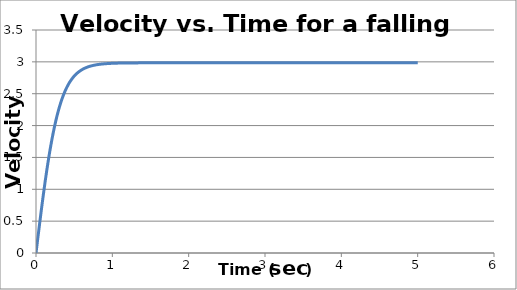
| Category | Series 0 |
|---|---|
| 0.0 | 0 |
| 0.005 | 0.049 |
| 0.01 | 0.098 |
| 0.015 | 0.147 |
| 0.02 | 0.196 |
| 0.025 | 0.245 |
| 0.030000000000000002 | 0.293 |
| 0.035 | 0.342 |
| 0.04 | 0.39 |
| 0.045 | 0.438 |
| 0.049999999999999996 | 0.486 |
| 0.05499999999999999 | 0.534 |
| 0.05999999999999999 | 0.581 |
| 0.06499999999999999 | 0.629 |
| 0.06999999999999999 | 0.675 |
| 0.075 | 0.722 |
| 0.08 | 0.768 |
| 0.085 | 0.814 |
| 0.09000000000000001 | 0.859 |
| 0.09500000000000001 | 0.904 |
| 0.10000000000000002 | 0.949 |
| 0.10500000000000002 | 0.993 |
| 0.11000000000000003 | 1.036 |
| 0.11500000000000003 | 1.079 |
| 0.12000000000000004 | 1.122 |
| 0.12500000000000003 | 1.164 |
| 0.13000000000000003 | 1.205 |
| 0.13500000000000004 | 1.247 |
| 0.14000000000000004 | 1.287 |
| 0.14500000000000005 | 1.327 |
| 0.15000000000000005 | 1.366 |
| 0.15500000000000005 | 1.405 |
| 0.16000000000000006 | 1.443 |
| 0.16500000000000006 | 1.481 |
| 0.17000000000000007 | 1.518 |
| 0.17500000000000007 | 1.554 |
| 0.18000000000000008 | 1.59 |
| 0.18500000000000008 | 1.625 |
| 0.19000000000000009 | 1.659 |
| 0.1950000000000001 | 1.693 |
| 0.2000000000000001 | 1.726 |
| 0.2050000000000001 | 1.759 |
| 0.2100000000000001 | 1.791 |
| 0.2150000000000001 | 1.822 |
| 0.2200000000000001 | 1.853 |
| 0.22500000000000012 | 1.883 |
| 0.23000000000000012 | 1.913 |
| 0.23500000000000013 | 1.941 |
| 0.24000000000000013 | 1.97 |
| 0.24500000000000013 | 1.997 |
| 0.2500000000000001 | 2.024 |
| 0.2550000000000001 | 2.051 |
| 0.2600000000000001 | 2.077 |
| 0.2650000000000001 | 2.102 |
| 0.27000000000000013 | 2.127 |
| 0.27500000000000013 | 2.151 |
| 0.28000000000000014 | 2.174 |
| 0.28500000000000014 | 2.197 |
| 0.29000000000000015 | 2.22 |
| 0.29500000000000015 | 2.242 |
| 0.30000000000000016 | 2.263 |
| 0.30500000000000016 | 2.284 |
| 0.31000000000000016 | 2.304 |
| 0.31500000000000017 | 2.324 |
| 0.3200000000000002 | 2.343 |
| 0.3250000000000002 | 2.362 |
| 0.3300000000000002 | 2.38 |
| 0.3350000000000002 | 2.398 |
| 0.3400000000000002 | 2.416 |
| 0.3450000000000002 | 2.433 |
| 0.3500000000000002 | 2.449 |
| 0.3550000000000002 | 2.465 |
| 0.3600000000000002 | 2.481 |
| 0.3650000000000002 | 2.496 |
| 0.3700000000000002 | 2.511 |
| 0.3750000000000002 | 2.525 |
| 0.3800000000000002 | 2.539 |
| 0.38500000000000023 | 2.552 |
| 0.39000000000000024 | 2.566 |
| 0.39500000000000024 | 2.578 |
| 0.40000000000000024 | 2.591 |
| 0.40500000000000025 | 2.603 |
| 0.41000000000000025 | 2.615 |
| 0.41500000000000026 | 2.626 |
| 0.42000000000000026 | 2.637 |
| 0.42500000000000027 | 2.648 |
| 0.43000000000000027 | 2.658 |
| 0.4350000000000003 | 2.668 |
| 0.4400000000000003 | 2.678 |
| 0.4450000000000003 | 2.688 |
| 0.4500000000000003 | 2.697 |
| 0.4550000000000003 | 2.706 |
| 0.4600000000000003 | 2.715 |
| 0.4650000000000003 | 2.723 |
| 0.4700000000000003 | 2.731 |
| 0.4750000000000003 | 2.739 |
| 0.4800000000000003 | 2.747 |
| 0.4850000000000003 | 2.755 |
| 0.4900000000000003 | 2.762 |
| 0.49500000000000033 | 2.769 |
| 0.5000000000000003 | 2.776 |
| 0.5050000000000003 | 2.782 |
| 0.5100000000000003 | 2.789 |
| 0.5150000000000003 | 2.795 |
| 0.5200000000000004 | 2.801 |
| 0.5250000000000004 | 2.807 |
| 0.5300000000000004 | 2.813 |
| 0.5350000000000004 | 2.818 |
| 0.5400000000000004 | 2.823 |
| 0.5450000000000004 | 2.829 |
| 0.5500000000000004 | 2.834 |
| 0.5550000000000004 | 2.838 |
| 0.5600000000000004 | 2.843 |
| 0.5650000000000004 | 2.848 |
| 0.5700000000000004 | 2.852 |
| 0.5750000000000004 | 2.856 |
| 0.5800000000000004 | 2.86 |
| 0.5850000000000004 | 2.864 |
| 0.5900000000000004 | 2.868 |
| 0.5950000000000004 | 2.872 |
| 0.6000000000000004 | 2.876 |
| 0.6050000000000004 | 2.879 |
| 0.6100000000000004 | 2.883 |
| 0.6150000000000004 | 2.886 |
| 0.6200000000000004 | 2.889 |
| 0.6250000000000004 | 2.892 |
| 0.6300000000000004 | 2.895 |
| 0.6350000000000005 | 2.898 |
| 0.6400000000000005 | 2.901 |
| 0.6450000000000005 | 2.904 |
| 0.6500000000000005 | 2.906 |
| 0.6550000000000005 | 2.909 |
| 0.6600000000000005 | 2.911 |
| 0.6650000000000005 | 2.914 |
| 0.6700000000000005 | 2.916 |
| 0.6750000000000005 | 2.918 |
| 0.6800000000000005 | 2.92 |
| 0.6850000000000005 | 2.922 |
| 0.6900000000000005 | 2.924 |
| 0.6950000000000005 | 2.926 |
| 0.7000000000000005 | 2.928 |
| 0.7050000000000005 | 2.93 |
| 0.7100000000000005 | 2.932 |
| 0.7150000000000005 | 2.934 |
| 0.7200000000000005 | 2.935 |
| 0.7250000000000005 | 2.937 |
| 0.7300000000000005 | 2.938 |
| 0.7350000000000005 | 2.94 |
| 0.7400000000000005 | 2.941 |
| 0.7450000000000006 | 2.943 |
| 0.7500000000000006 | 2.944 |
| 0.7550000000000006 | 2.946 |
| 0.7600000000000006 | 2.947 |
| 0.7650000000000006 | 2.948 |
| 0.7700000000000006 | 2.949 |
| 0.7750000000000006 | 2.95 |
| 0.7800000000000006 | 2.952 |
| 0.7850000000000006 | 2.953 |
| 0.7900000000000006 | 2.954 |
| 0.7950000000000006 | 2.955 |
| 0.8000000000000006 | 2.956 |
| 0.8050000000000006 | 2.957 |
| 0.8100000000000006 | 2.958 |
| 0.8150000000000006 | 2.958 |
| 0.8200000000000006 | 2.959 |
| 0.8250000000000006 | 2.96 |
| 0.8300000000000006 | 2.961 |
| 0.8350000000000006 | 2.962 |
| 0.8400000000000006 | 2.962 |
| 0.8450000000000006 | 2.963 |
| 0.8500000000000006 | 2.964 |
| 0.8550000000000006 | 2.965 |
| 0.8600000000000007 | 2.965 |
| 0.8650000000000007 | 2.966 |
| 0.8700000000000007 | 2.967 |
| 0.8750000000000007 | 2.967 |
| 0.8800000000000007 | 2.968 |
| 0.8850000000000007 | 2.968 |
| 0.8900000000000007 | 2.969 |
| 0.8950000000000007 | 2.969 |
| 0.9000000000000007 | 2.97 |
| 0.9050000000000007 | 2.97 |
| 0.9100000000000007 | 2.971 |
| 0.9150000000000007 | 2.971 |
| 0.9200000000000007 | 2.972 |
| 0.9250000000000007 | 2.972 |
| 0.9300000000000007 | 2.973 |
| 0.9350000000000007 | 2.973 |
| 0.9400000000000007 | 2.973 |
| 0.9450000000000007 | 2.974 |
| 0.9500000000000007 | 2.974 |
| 0.9550000000000007 | 2.974 |
| 0.9600000000000007 | 2.975 |
| 0.9650000000000007 | 2.975 |
| 0.9700000000000008 | 2.975 |
| 0.9750000000000008 | 2.976 |
| 0.9800000000000008 | 2.976 |
| 0.9850000000000008 | 2.976 |
| 0.9900000000000008 | 2.977 |
| 0.9950000000000008 | 2.977 |
| 1.0000000000000007 | 2.977 |
| 1.0050000000000006 | 2.977 |
| 1.0100000000000005 | 2.978 |
| 1.0150000000000003 | 2.978 |
| 1.0200000000000002 | 2.978 |
| 1.0250000000000001 | 2.978 |
| 1.03 | 2.979 |
| 1.035 | 2.979 |
| 1.0399999999999998 | 2.979 |
| 1.0449999999999997 | 2.979 |
| 1.0499999999999996 | 2.979 |
| 1.0549999999999995 | 2.979 |
| 1.0599999999999994 | 2.98 |
| 1.0649999999999993 | 2.98 |
| 1.0699999999999992 | 2.98 |
| 1.074999999999999 | 2.98 |
| 1.079999999999999 | 2.98 |
| 1.0849999999999989 | 2.98 |
| 1.0899999999999987 | 2.981 |
| 1.0949999999999986 | 2.981 |
| 1.0999999999999985 | 2.981 |
| 1.1049999999999984 | 2.981 |
| 1.1099999999999983 | 2.981 |
| 1.1149999999999982 | 2.981 |
| 1.119999999999998 | 2.981 |
| 1.124999999999998 | 2.981 |
| 1.129999999999998 | 2.982 |
| 1.1349999999999978 | 2.982 |
| 1.1399999999999977 | 2.982 |
| 1.1449999999999976 | 2.982 |
| 1.1499999999999975 | 2.982 |
| 1.1549999999999974 | 2.982 |
| 1.1599999999999973 | 2.982 |
| 1.1649999999999971 | 2.982 |
| 1.169999999999997 | 2.982 |
| 1.174999999999997 | 2.982 |
| 1.1799999999999968 | 2.982 |
| 1.1849999999999967 | 2.983 |
| 1.1899999999999966 | 2.983 |
| 1.1949999999999965 | 2.983 |
| 1.1999999999999964 | 2.983 |
| 1.2049999999999963 | 2.983 |
| 1.2099999999999962 | 2.983 |
| 1.214999999999996 | 2.983 |
| 1.219999999999996 | 2.983 |
| 1.2249999999999959 | 2.983 |
| 1.2299999999999958 | 2.983 |
| 1.2349999999999957 | 2.983 |
| 1.2399999999999956 | 2.983 |
| 1.2449999999999954 | 2.983 |
| 1.2499999999999953 | 2.983 |
| 1.2549999999999952 | 2.983 |
| 1.2599999999999951 | 2.983 |
| 1.264999999999995 | 2.983 |
| 1.269999999999995 | 2.984 |
| 1.2749999999999948 | 2.984 |
| 1.2799999999999947 | 2.984 |
| 1.2849999999999946 | 2.984 |
| 1.2899999999999945 | 2.984 |
| 1.2949999999999944 | 2.984 |
| 1.2999999999999943 | 2.984 |
| 1.3049999999999942 | 2.984 |
| 1.309999999999994 | 2.984 |
| 1.314999999999994 | 2.984 |
| 1.3199999999999938 | 2.984 |
| 1.3249999999999937 | 2.984 |
| 1.3299999999999936 | 2.984 |
| 1.3349999999999935 | 2.984 |
| 1.3399999999999934 | 2.984 |
| 1.3449999999999933 | 2.984 |
| 1.3499999999999932 | 2.984 |
| 1.354999999999993 | 2.984 |
| 1.359999999999993 | 2.984 |
| 1.3649999999999929 | 2.984 |
| 1.3699999999999928 | 2.984 |
| 1.3749999999999927 | 2.984 |
| 1.3799999999999926 | 2.984 |
| 1.3849999999999925 | 2.984 |
| 1.3899999999999924 | 2.984 |
| 1.3949999999999922 | 2.984 |
| 1.3999999999999921 | 2.984 |
| 1.404999999999992 | 2.984 |
| 1.409999999999992 | 2.984 |
| 1.4149999999999918 | 2.984 |
| 1.4199999999999917 | 2.984 |
| 1.4249999999999916 | 2.984 |
| 1.4299999999999915 | 2.984 |
| 1.4349999999999914 | 2.984 |
| 1.4399999999999913 | 2.984 |
| 1.4449999999999912 | 2.984 |
| 1.449999999999991 | 2.984 |
| 1.454999999999991 | 2.984 |
| 1.4599999999999909 | 2.984 |
| 1.4649999999999908 | 2.984 |
| 1.4699999999999906 | 2.984 |
| 1.4749999999999905 | 2.984 |
| 1.4799999999999904 | 2.984 |
| 1.4849999999999903 | 2.985 |
| 1.4899999999999902 | 2.985 |
| 1.4949999999999901 | 2.985 |
| 1.49999999999999 | 2.985 |
| 1.50499999999999 | 2.985 |
| 1.5099999999999898 | 2.985 |
| 1.5149999999999897 | 2.985 |
| 1.5199999999999896 | 2.985 |
| 1.5249999999999895 | 2.985 |
| 1.5299999999999894 | 2.985 |
| 1.5349999999999893 | 2.985 |
| 1.5399999999999892 | 2.985 |
| 1.544999999999989 | 2.985 |
| 1.549999999999989 | 2.985 |
| 1.5549999999999888 | 2.985 |
| 1.5599999999999887 | 2.985 |
| 1.5649999999999886 | 2.985 |
| 1.5699999999999885 | 2.985 |
| 1.5749999999999884 | 2.985 |
| 1.5799999999999883 | 2.985 |
| 1.5849999999999882 | 2.985 |
| 1.589999999999988 | 2.985 |
| 1.594999999999988 | 2.985 |
| 1.5999999999999879 | 2.985 |
| 1.6049999999999878 | 2.985 |
| 1.6099999999999877 | 2.985 |
| 1.6149999999999876 | 2.985 |
| 1.6199999999999875 | 2.985 |
| 1.6249999999999873 | 2.985 |
| 1.6299999999999872 | 2.985 |
| 1.6349999999999871 | 2.985 |
| 1.639999999999987 | 2.985 |
| 1.644999999999987 | 2.985 |
| 1.6499999999999868 | 2.985 |
| 1.6549999999999867 | 2.985 |
| 1.6599999999999866 | 2.985 |
| 1.6649999999999865 | 2.985 |
| 1.6699999999999864 | 2.985 |
| 1.6749999999999863 | 2.985 |
| 1.6799999999999862 | 2.985 |
| 1.684999999999986 | 2.985 |
| 1.689999999999986 | 2.985 |
| 1.6949999999999859 | 2.985 |
| 1.6999999999999857 | 2.985 |
| 1.7049999999999856 | 2.985 |
| 1.7099999999999855 | 2.985 |
| 1.7149999999999854 | 2.985 |
| 1.7199999999999853 | 2.985 |
| 1.7249999999999852 | 2.985 |
| 1.729999999999985 | 2.985 |
| 1.734999999999985 | 2.985 |
| 1.739999999999985 | 2.985 |
| 1.7449999999999848 | 2.985 |
| 1.7499999999999847 | 2.985 |
| 1.7549999999999846 | 2.985 |
| 1.7599999999999845 | 2.985 |
| 1.7649999999999844 | 2.985 |
| 1.7699999999999843 | 2.985 |
| 1.7749999999999841 | 2.985 |
| 1.779999999999984 | 2.985 |
| 1.784999999999984 | 2.985 |
| 1.7899999999999838 | 2.985 |
| 1.7949999999999837 | 2.985 |
| 1.7999999999999836 | 2.985 |
| 1.8049999999999835 | 2.985 |
| 1.8099999999999834 | 2.985 |
| 1.8149999999999833 | 2.985 |
| 1.8199999999999832 | 2.985 |
| 1.824999999999983 | 2.985 |
| 1.829999999999983 | 2.985 |
| 1.8349999999999829 | 2.985 |
| 1.8399999999999828 | 2.985 |
| 1.8449999999999827 | 2.985 |
| 1.8499999999999825 | 2.985 |
| 1.8549999999999824 | 2.985 |
| 1.8599999999999823 | 2.985 |
| 1.8649999999999822 | 2.985 |
| 1.8699999999999821 | 2.985 |
| 1.874999999999982 | 2.985 |
| 1.879999999999982 | 2.985 |
| 1.8849999999999818 | 2.985 |
| 1.8899999999999817 | 2.985 |
| 1.8949999999999816 | 2.985 |
| 1.8999999999999815 | 2.985 |
| 1.9049999999999814 | 2.985 |
| 1.9099999999999813 | 2.985 |
| 1.9149999999999812 | 2.985 |
| 1.919999999999981 | 2.985 |
| 1.924999999999981 | 2.985 |
| 1.9299999999999808 | 2.985 |
| 1.9349999999999807 | 2.985 |
| 1.9399999999999806 | 2.985 |
| 1.9449999999999805 | 2.985 |
| 1.9499999999999804 | 2.985 |
| 1.9549999999999803 | 2.985 |
| 1.9599999999999802 | 2.985 |
| 1.96499999999998 | 2.985 |
| 1.96999999999998 | 2.985 |
| 1.9749999999999799 | 2.985 |
| 1.9799999999999798 | 2.985 |
| 1.9849999999999797 | 2.985 |
| 1.9899999999999796 | 2.985 |
| 1.9949999999999795 | 2.985 |
| 1.9999999999999793 | 2.985 |
| 2.0049999999999795 | 2.985 |
| 2.0099999999999794 | 2.985 |
| 2.0149999999999793 | 2.985 |
| 2.019999999999979 | 2.985 |
| 2.024999999999979 | 2.985 |
| 2.029999999999979 | 2.985 |
| 2.034999999999979 | 2.985 |
| 2.0399999999999787 | 2.985 |
| 2.0449999999999786 | 2.985 |
| 2.0499999999999785 | 2.985 |
| 2.0549999999999784 | 2.985 |
| 2.0599999999999783 | 2.985 |
| 2.064999999999978 | 2.985 |
| 2.069999999999978 | 2.985 |
| 2.074999999999978 | 2.985 |
| 2.079999999999978 | 2.985 |
| 2.0849999999999778 | 2.985 |
| 2.0899999999999777 | 2.985 |
| 2.0949999999999775 | 2.985 |
| 2.0999999999999774 | 2.985 |
| 2.1049999999999773 | 2.985 |
| 2.1099999999999772 | 2.985 |
| 2.114999999999977 | 2.985 |
| 2.119999999999977 | 2.985 |
| 2.124999999999977 | 2.985 |
| 2.129999999999977 | 2.985 |
| 2.1349999999999767 | 2.985 |
| 2.1399999999999766 | 2.985 |
| 2.1449999999999765 | 2.985 |
| 2.1499999999999764 | 2.985 |
| 2.1549999999999763 | 2.985 |
| 2.159999999999976 | 2.985 |
| 2.164999999999976 | 2.985 |
| 2.169999999999976 | 2.985 |
| 2.174999999999976 | 2.985 |
| 2.1799999999999757 | 2.985 |
| 2.1849999999999756 | 2.985 |
| 2.1899999999999755 | 2.985 |
| 2.1949999999999754 | 2.985 |
| 2.1999999999999753 | 2.985 |
| 2.204999999999975 | 2.985 |
| 2.209999999999975 | 2.985 |
| 2.214999999999975 | 2.985 |
| 2.219999999999975 | 2.985 |
| 2.2249999999999748 | 2.985 |
| 2.2299999999999747 | 2.985 |
| 2.2349999999999746 | 2.985 |
| 2.2399999999999745 | 2.985 |
| 2.2449999999999743 | 2.985 |
| 2.2499999999999742 | 2.985 |
| 2.254999999999974 | 2.985 |
| 2.259999999999974 | 2.985 |
| 2.264999999999974 | 2.985 |
| 2.269999999999974 | 2.985 |
| 2.2749999999999737 | 2.985 |
| 2.2799999999999736 | 2.985 |
| 2.2849999999999735 | 2.985 |
| 2.2899999999999734 | 2.985 |
| 2.2949999999999733 | 2.985 |
| 2.299999999999973 | 2.985 |
| 2.304999999999973 | 2.985 |
| 2.309999999999973 | 2.985 |
| 2.314999999999973 | 2.985 |
| 2.3199999999999728 | 2.985 |
| 2.3249999999999726 | 2.985 |
| 2.3299999999999725 | 2.985 |
| 2.3349999999999724 | 2.985 |
| 2.3399999999999723 | 2.985 |
| 2.344999999999972 | 2.985 |
| 2.349999999999972 | 2.985 |
| 2.354999999999972 | 2.985 |
| 2.359999999999972 | 2.985 |
| 2.364999999999972 | 2.985 |
| 2.3699999999999717 | 2.985 |
| 2.3749999999999716 | 2.985 |
| 2.3799999999999715 | 2.985 |
| 2.3849999999999714 | 2.985 |
| 2.3899999999999713 | 2.985 |
| 2.394999999999971 | 2.985 |
| 2.399999999999971 | 2.985 |
| 2.404999999999971 | 2.985 |
| 2.409999999999971 | 2.985 |
| 2.4149999999999707 | 2.985 |
| 2.4199999999999706 | 2.985 |
| 2.4249999999999705 | 2.985 |
| 2.4299999999999704 | 2.985 |
| 2.4349999999999703 | 2.985 |
| 2.43999999999997 | 2.985 |
| 2.44499999999997 | 2.985 |
| 2.44999999999997 | 2.985 |
| 2.45499999999997 | 2.985 |
| 2.4599999999999698 | 2.985 |
| 2.4649999999999697 | 2.985 |
| 2.4699999999999696 | 2.985 |
| 2.4749999999999694 | 2.985 |
| 2.4799999999999693 | 2.985 |
| 2.4849999999999692 | 2.985 |
| 2.489999999999969 | 2.985 |
| 2.494999999999969 | 2.985 |
| 2.499999999999969 | 2.985 |
| 2.504999999999969 | 2.985 |
| 2.5099999999999687 | 2.985 |
| 2.5149999999999686 | 2.985 |
| 2.5199999999999685 | 2.985 |
| 2.5249999999999684 | 2.985 |
| 2.5299999999999683 | 2.985 |
| 2.534999999999968 | 2.985 |
| 2.539999999999968 | 2.985 |
| 2.544999999999968 | 2.985 |
| 2.549999999999968 | 2.985 |
| 2.5549999999999677 | 2.985 |
| 2.5599999999999676 | 2.985 |
| 2.5649999999999675 | 2.985 |
| 2.5699999999999674 | 2.985 |
| 2.5749999999999673 | 2.985 |
| 2.579999999999967 | 2.985 |
| 2.584999999999967 | 2.985 |
| 2.589999999999967 | 2.985 |
| 2.594999999999967 | 2.985 |
| 2.599999999999967 | 2.985 |
| 2.6049999999999667 | 2.985 |
| 2.6099999999999666 | 2.985 |
| 2.6149999999999665 | 2.985 |
| 2.6199999999999664 | 2.985 |
| 2.6249999999999662 | 2.985 |
| 2.629999999999966 | 2.985 |
| 2.634999999999966 | 2.985 |
| 2.639999999999966 | 2.985 |
| 2.644999999999966 | 2.985 |
| 2.6499999999999657 | 2.985 |
| 2.6549999999999656 | 2.985 |
| 2.6599999999999655 | 2.985 |
| 2.6649999999999654 | 2.985 |
| 2.6699999999999653 | 2.985 |
| 2.674999999999965 | 2.985 |
| 2.679999999999965 | 2.985 |
| 2.684999999999965 | 2.985 |
| 2.689999999999965 | 2.985 |
| 2.6949999999999648 | 2.985 |
| 2.6999999999999647 | 2.985 |
| 2.7049999999999645 | 2.985 |
| 2.7099999999999644 | 2.985 |
| 2.7149999999999643 | 2.985 |
| 2.7199999999999642 | 2.985 |
| 2.724999999999964 | 2.985 |
| 2.729999999999964 | 2.985 |
| 2.734999999999964 | 2.985 |
| 2.739999999999964 | 2.985 |
| 2.7449999999999637 | 2.985 |
| 2.7499999999999636 | 2.985 |
| 2.7549999999999635 | 2.985 |
| 2.7599999999999634 | 2.985 |
| 2.7649999999999633 | 2.985 |
| 2.769999999999963 | 2.985 |
| 2.774999999999963 | 2.985 |
| 2.779999999999963 | 2.985 |
| 2.784999999999963 | 2.985 |
| 2.7899999999999627 | 2.985 |
| 2.7949999999999626 | 2.985 |
| 2.7999999999999625 | 2.985 |
| 2.8049999999999624 | 2.985 |
| 2.8099999999999623 | 2.985 |
| 2.814999999999962 | 2.985 |
| 2.819999999999962 | 2.985 |
| 2.824999999999962 | 2.985 |
| 2.829999999999962 | 2.985 |
| 2.8349999999999618 | 2.985 |
| 2.8399999999999617 | 2.985 |
| 2.8449999999999616 | 2.985 |
| 2.8499999999999615 | 2.985 |
| 2.8549999999999613 | 2.985 |
| 2.8599999999999612 | 2.985 |
| 2.864999999999961 | 2.985 |
| 2.869999999999961 | 2.985 |
| 2.874999999999961 | 2.985 |
| 2.879999999999961 | 2.985 |
| 2.8849999999999607 | 2.985 |
| 2.8899999999999606 | 2.985 |
| 2.8949999999999605 | 2.985 |
| 2.8999999999999604 | 2.985 |
| 2.9049999999999603 | 2.985 |
| 2.90999999999996 | 2.985 |
| 2.91499999999996 | 2.985 |
| 2.91999999999996 | 2.985 |
| 2.92499999999996 | 2.985 |
| 2.9299999999999597 | 2.985 |
| 2.9349999999999596 | 2.985 |
| 2.9399999999999595 | 2.985 |
| 2.9449999999999594 | 2.985 |
| 2.9499999999999593 | 2.985 |
| 2.954999999999959 | 2.985 |
| 2.959999999999959 | 2.985 |
| 2.964999999999959 | 2.985 |
| 2.969999999999959 | 2.985 |
| 2.974999999999959 | 2.985 |
| 2.9799999999999587 | 2.985 |
| 2.9849999999999586 | 2.985 |
| 2.9899999999999585 | 2.985 |
| 2.9949999999999584 | 2.985 |
| 2.9999999999999583 | 2.985 |
| 3.004999999999958 | 2.985 |
| 3.009999999999958 | 2.985 |
| 3.014999999999958 | 2.985 |
| 3.019999999999958 | 2.985 |
| 3.0249999999999577 | 2.985 |
| 3.0299999999999576 | 2.985 |
| 3.0349999999999575 | 2.985 |
| 3.0399999999999574 | 2.985 |
| 3.0449999999999573 | 2.985 |
| 3.049999999999957 | 2.985 |
| 3.054999999999957 | 2.985 |
| 3.059999999999957 | 2.985 |
| 3.064999999999957 | 2.985 |
| 3.0699999999999568 | 2.985 |
| 3.0749999999999567 | 2.985 |
| 3.0799999999999566 | 2.985 |
| 3.0849999999999564 | 2.985 |
| 3.0899999999999563 | 2.985 |
| 3.0949999999999562 | 2.985 |
| 3.099999999999956 | 2.985 |
| 3.104999999999956 | 2.985 |
| 3.109999999999956 | 2.985 |
| 3.114999999999956 | 2.985 |
| 3.1199999999999557 | 2.985 |
| 3.1249999999999556 | 2.985 |
| 3.1299999999999555 | 2.985 |
| 3.1349999999999554 | 2.985 |
| 3.1399999999999553 | 2.985 |
| 3.144999999999955 | 2.985 |
| 3.149999999999955 | 2.985 |
| 3.154999999999955 | 2.985 |
| 3.159999999999955 | 2.985 |
| 3.1649999999999547 | 2.985 |
| 3.1699999999999546 | 2.985 |
| 3.1749999999999545 | 2.985 |
| 3.1799999999999544 | 2.985 |
| 3.1849999999999543 | 2.985 |
| 3.189999999999954 | 2.985 |
| 3.194999999999954 | 2.985 |
| 3.199999999999954 | 2.985 |
| 3.204999999999954 | 2.985 |
| 3.209999999999954 | 2.985 |
| 3.2149999999999537 | 2.985 |
| 3.2199999999999536 | 2.985 |
| 3.2249999999999535 | 2.985 |
| 3.2299999999999534 | 2.985 |
| 3.2349999999999532 | 2.985 |
| 3.239999999999953 | 2.985 |
| 3.244999999999953 | 2.985 |
| 3.249999999999953 | 2.985 |
| 3.254999999999953 | 2.985 |
| 3.2599999999999527 | 2.985 |
| 3.2649999999999526 | 2.985 |
| 3.2699999999999525 | 2.985 |
| 3.2749999999999524 | 2.985 |
| 3.2799999999999523 | 2.985 |
| 3.284999999999952 | 2.985 |
| 3.289999999999952 | 2.985 |
| 3.294999999999952 | 2.985 |
| 3.299999999999952 | 2.985 |
| 3.3049999999999518 | 2.985 |
| 3.3099999999999516 | 2.985 |
| 3.3149999999999515 | 2.985 |
| 3.3199999999999514 | 2.985 |
| 3.3249999999999513 | 2.985 |
| 3.329999999999951 | 2.985 |
| 3.334999999999951 | 2.985 |
| 3.339999999999951 | 2.985 |
| 3.344999999999951 | 2.985 |
| 3.349999999999951 | 2.985 |
| 3.3549999999999507 | 2.985 |
| 3.3599999999999506 | 2.985 |
| 3.3649999999999505 | 2.985 |
| 3.3699999999999504 | 2.985 |
| 3.3749999999999503 | 2.985 |
| 3.37999999999995 | 2.985 |
| 3.38499999999995 | 2.985 |
| 3.38999999999995 | 2.985 |
| 3.39499999999995 | 2.985 |
| 3.3999999999999497 | 2.985 |
| 3.4049999999999496 | 2.985 |
| 3.4099999999999495 | 2.985 |
| 3.4149999999999494 | 2.985 |
| 3.4199999999999493 | 2.985 |
| 3.424999999999949 | 2.985 |
| 3.429999999999949 | 2.985 |
| 3.434999999999949 | 2.985 |
| 3.439999999999949 | 2.985 |
| 3.4449999999999488 | 2.985 |
| 3.4499999999999487 | 2.985 |
| 3.4549999999999486 | 2.985 |
| 3.4599999999999485 | 2.985 |
| 3.4649999999999483 | 2.985 |
| 3.4699999999999482 | 2.985 |
| 3.474999999999948 | 2.985 |
| 3.479999999999948 | 2.985 |
| 3.484999999999948 | 2.985 |
| 3.489999999999948 | 2.985 |
| 3.4949999999999477 | 2.985 |
| 3.4999999999999476 | 2.985 |
| 3.5049999999999475 | 2.985 |
| 3.5099999999999474 | 2.985 |
| 3.5149999999999473 | 2.985 |
| 3.519999999999947 | 2.985 |
| 3.524999999999947 | 2.985 |
| 3.529999999999947 | 2.985 |
| 3.534999999999947 | 2.985 |
| 3.5399999999999467 | 2.985 |
| 3.5449999999999466 | 2.985 |
| 3.5499999999999465 | 2.985 |
| 3.5549999999999464 | 2.985 |
| 3.5599999999999463 | 2.985 |
| 3.564999999999946 | 2.985 |
| 3.569999999999946 | 2.985 |
| 3.574999999999946 | 2.985 |
| 3.579999999999946 | 2.985 |
| 3.584999999999946 | 2.985 |
| 3.5899999999999457 | 2.985 |
| 3.5949999999999456 | 2.985 |
| 3.5999999999999455 | 2.985 |
| 3.6049999999999454 | 2.985 |
| 3.6099999999999453 | 2.985 |
| 3.614999999999945 | 2.985 |
| 3.619999999999945 | 2.985 |
| 3.624999999999945 | 2.985 |
| 3.629999999999945 | 2.985 |
| 3.6349999999999447 | 2.985 |
| 3.6399999999999446 | 2.985 |
| 3.6449999999999445 | 2.985 |
| 3.6499999999999444 | 2.985 |
| 3.6549999999999443 | 2.985 |
| 3.659999999999944 | 2.985 |
| 3.664999999999944 | 2.985 |
| 3.669999999999944 | 2.985 |
| 3.674999999999944 | 2.985 |
| 3.6799999999999438 | 2.985 |
| 3.6849999999999437 | 2.985 |
| 3.6899999999999435 | 2.985 |
| 3.6949999999999434 | 2.985 |
| 3.6999999999999433 | 2.985 |
| 3.7049999999999432 | 2.985 |
| 3.709999999999943 | 2.985 |
| 3.714999999999943 | 2.985 |
| 3.719999999999943 | 2.985 |
| 3.724999999999943 | 2.985 |
| 3.7299999999999427 | 2.985 |
| 3.7349999999999426 | 2.985 |
| 3.7399999999999425 | 2.985 |
| 3.7449999999999424 | 2.985 |
| 3.7499999999999423 | 2.985 |
| 3.754999999999942 | 2.985 |
| 3.759999999999942 | 2.985 |
| 3.764999999999942 | 2.985 |
| 3.769999999999942 | 2.985 |
| 3.7749999999999417 | 2.985 |
| 3.7799999999999416 | 2.985 |
| 3.7849999999999415 | 2.985 |
| 3.7899999999999414 | 2.985 |
| 3.7949999999999413 | 2.985 |
| 3.799999999999941 | 2.985 |
| 3.804999999999941 | 2.985 |
| 3.809999999999941 | 2.985 |
| 3.814999999999941 | 2.985 |
| 3.8199999999999408 | 2.985 |
| 3.8249999999999407 | 2.985 |
| 3.8299999999999406 | 2.985 |
| 3.8349999999999405 | 2.985 |
| 3.8399999999999403 | 2.985 |
| 3.8449999999999402 | 2.985 |
| 3.84999999999994 | 2.985 |
| 3.85499999999994 | 2.985 |
| 3.85999999999994 | 2.985 |
| 3.86499999999994 | 2.985 |
| 3.8699999999999397 | 2.985 |
| 3.8749999999999396 | 2.985 |
| 3.8799999999999395 | 2.985 |
| 3.8849999999999394 | 2.985 |
| 3.8899999999999393 | 2.985 |
| 3.894999999999939 | 2.985 |
| 3.899999999999939 | 2.985 |
| 3.904999999999939 | 2.985 |
| 3.909999999999939 | 2.985 |
| 3.9149999999999388 | 2.985 |
| 3.9199999999999386 | 2.985 |
| 3.9249999999999385 | 2.985 |
| 3.9299999999999384 | 2.985 |
| 3.9349999999999383 | 2.985 |
| 3.939999999999938 | 2.985 |
| 3.944999999999938 | 2.985 |
| 3.949999999999938 | 2.985 |
| 3.954999999999938 | 2.985 |
| 3.959999999999938 | 2.985 |
| 3.9649999999999377 | 2.985 |
| 3.9699999999999376 | 2.985 |
| 3.9749999999999375 | 2.985 |
| 3.9799999999999374 | 2.985 |
| 3.9849999999999373 | 2.985 |
| 3.989999999999937 | 2.985 |
| 3.994999999999937 | 2.985 |
| 3.999999999999937 | 2.985 |
| 4.004999999999937 | 2.985 |
| 4.009999999999937 | 2.985 |
| 4.014999999999937 | 2.985 |
| 4.0199999999999365 | 2.985 |
| 4.024999999999936 | 2.985 |
| 4.029999999999936 | 2.985 |
| 4.034999999999936 | 2.985 |
| 4.039999999999936 | 2.985 |
| 4.044999999999936 | 2.985 |
| 4.049999999999936 | 2.985 |
| 4.054999999999936 | 2.985 |
| 4.059999999999936 | 2.985 |
| 4.0649999999999356 | 2.985 |
| 4.0699999999999354 | 2.985 |
| 4.074999999999935 | 2.985 |
| 4.079999999999935 | 2.985 |
| 4.084999999999935 | 2.985 |
| 4.089999999999935 | 2.985 |
| 4.094999999999935 | 2.985 |
| 4.099999999999935 | 2.985 |
| 4.104999999999935 | 2.985 |
| 4.109999999999935 | 2.985 |
| 4.1149999999999345 | 2.985 |
| 4.119999999999934 | 2.985 |
| 4.124999999999934 | 2.985 |
| 4.129999999999934 | 2.985 |
| 4.134999999999934 | 2.985 |
| 4.139999999999934 | 2.985 |
| 4.144999999999934 | 2.985 |
| 4.149999999999934 | 2.985 |
| 4.154999999999934 | 2.985 |
| 4.1599999999999335 | 2.985 |
| 4.164999999999933 | 2.985 |
| 4.169999999999933 | 2.985 |
| 4.174999999999933 | 2.985 |
| 4.179999999999933 | 2.985 |
| 4.184999999999933 | 2.985 |
| 4.189999999999933 | 2.985 |
| 4.194999999999933 | 2.985 |
| 4.199999999999933 | 2.985 |
| 4.204999999999933 | 2.985 |
| 4.2099999999999325 | 2.985 |
| 4.214999999999932 | 2.985 |
| 4.219999999999932 | 2.985 |
| 4.224999999999932 | 2.985 |
| 4.229999999999932 | 2.985 |
| 4.234999999999932 | 2.985 |
| 4.239999999999932 | 2.985 |
| 4.244999999999932 | 2.985 |
| 4.249999999999932 | 2.985 |
| 4.2549999999999315 | 2.985 |
| 4.259999999999931 | 2.985 |
| 4.264999999999931 | 2.985 |
| 4.269999999999931 | 2.985 |
| 4.274999999999931 | 2.985 |
| 4.279999999999931 | 2.985 |
| 4.284999999999931 | 2.985 |
| 4.289999999999931 | 2.985 |
| 4.294999999999931 | 2.985 |
| 4.2999999999999305 | 2.985 |
| 4.30499999999993 | 2.985 |
| 4.30999999999993 | 2.985 |
| 4.31499999999993 | 2.985 |
| 4.31999999999993 | 2.985 |
| 4.32499999999993 | 2.985 |
| 4.32999999999993 | 2.985 |
| 4.33499999999993 | 2.985 |
| 4.33999999999993 | 2.985 |
| 4.34499999999993 | 2.985 |
| 4.3499999999999295 | 2.985 |
| 4.354999999999929 | 2.985 |
| 4.359999999999929 | 2.985 |
| 4.364999999999929 | 2.985 |
| 4.369999999999929 | 2.985 |
| 4.374999999999929 | 2.985 |
| 4.379999999999929 | 2.985 |
| 4.384999999999929 | 2.985 |
| 4.389999999999929 | 2.985 |
| 4.3949999999999285 | 2.985 |
| 4.399999999999928 | 2.985 |
| 4.404999999999928 | 2.985 |
| 4.409999999999928 | 2.985 |
| 4.414999999999928 | 2.985 |
| 4.419999999999928 | 2.985 |
| 4.424999999999928 | 2.985 |
| 4.429999999999928 | 2.985 |
| 4.434999999999928 | 2.985 |
| 4.439999999999928 | 2.985 |
| 4.4449999999999275 | 2.985 |
| 4.449999999999927 | 2.985 |
| 4.454999999999927 | 2.985 |
| 4.459999999999927 | 2.985 |
| 4.464999999999927 | 2.985 |
| 4.469999999999927 | 2.985 |
| 4.474999999999927 | 2.985 |
| 4.479999999999927 | 2.985 |
| 4.484999999999927 | 2.985 |
| 4.4899999999999265 | 2.985 |
| 4.494999999999926 | 2.985 |
| 4.499999999999926 | 2.985 |
| 4.504999999999926 | 2.985 |
| 4.509999999999926 | 2.985 |
| 4.514999999999926 | 2.985 |
| 4.519999999999926 | 2.985 |
| 4.524999999999926 | 2.985 |
| 4.529999999999926 | 2.985 |
| 4.5349999999999255 | 2.985 |
| 4.539999999999925 | 2.985 |
| 4.544999999999925 | 2.985 |
| 4.549999999999925 | 2.985 |
| 4.554999999999925 | 2.985 |
| 4.559999999999925 | 2.985 |
| 4.564999999999925 | 2.985 |
| 4.569999999999925 | 2.985 |
| 4.574999999999925 | 2.985 |
| 4.579999999999925 | 2.985 |
| 4.5849999999999245 | 2.985 |
| 4.589999999999924 | 2.985 |
| 4.594999999999924 | 2.985 |
| 4.599999999999924 | 2.985 |
| 4.604999999999924 | 2.985 |
| 4.609999999999924 | 2.985 |
| 4.614999999999924 | 2.985 |
| 4.619999999999924 | 2.985 |
| 4.624999999999924 | 2.985 |
| 4.6299999999999235 | 2.985 |
| 4.634999999999923 | 2.985 |
| 4.639999999999923 | 2.985 |
| 4.644999999999923 | 2.985 |
| 4.649999999999923 | 2.985 |
| 4.654999999999923 | 2.985 |
| 4.659999999999923 | 2.985 |
| 4.664999999999923 | 2.985 |
| 4.669999999999923 | 2.985 |
| 4.6749999999999226 | 2.985 |
| 4.6799999999999224 | 2.985 |
| 4.684999999999922 | 2.985 |
| 4.689999999999922 | 2.985 |
| 4.694999999999922 | 2.985 |
| 4.699999999999922 | 2.985 |
| 4.704999999999922 | 2.985 |
| 4.709999999999922 | 2.985 |
| 4.714999999999922 | 2.985 |
| 4.719999999999922 | 2.985 |
| 4.7249999999999215 | 2.985 |
| 4.729999999999921 | 2.985 |
| 4.734999999999921 | 2.985 |
| 4.739999999999921 | 2.985 |
| 4.744999999999921 | 2.985 |
| 4.749999999999921 | 2.985 |
| 4.754999999999921 | 2.985 |
| 4.759999999999921 | 2.985 |
| 4.764999999999921 | 2.985 |
| 4.7699999999999205 | 2.985 |
| 4.77499999999992 | 2.985 |
| 4.77999999999992 | 2.985 |
| 4.78499999999992 | 2.985 |
| 4.78999999999992 | 2.985 |
| 4.79499999999992 | 2.985 |
| 4.79999999999992 | 2.985 |
| 4.80499999999992 | 2.985 |
| 4.80999999999992 | 2.985 |
| 4.81499999999992 | 2.985 |
| 4.8199999999999195 | 2.985 |
| 4.824999999999919 | 2.985 |
| 4.829999999999919 | 2.985 |
| 4.834999999999919 | 2.985 |
| 4.839999999999919 | 2.985 |
| 4.844999999999919 | 2.985 |
| 4.849999999999919 | 2.985 |
| 4.854999999999919 | 2.985 |
| 4.859999999999919 | 2.985 |
| 4.8649999999999185 | 2.985 |
| 4.869999999999918 | 2.985 |
| 4.874999999999918 | 2.985 |
| 4.879999999999918 | 2.985 |
| 4.884999999999918 | 2.985 |
| 4.889999999999918 | 2.985 |
| 4.894999999999918 | 2.985 |
| 4.899999999999918 | 2.985 |
| 4.904999999999918 | 2.985 |
| 4.9099999999999175 | 2.985 |
| 4.914999999999917 | 2.985 |
| 4.919999999999917 | 2.985 |
| 4.924999999999917 | 2.985 |
| 4.929999999999917 | 2.985 |
| 4.934999999999917 | 2.985 |
| 4.939999999999917 | 2.985 |
| 4.944999999999917 | 2.985 |
| 4.949999999999917 | 2.985 |
| 4.954999999999917 | 2.985 |
| 4.9599999999999165 | 2.985 |
| 4.964999999999916 | 2.985 |
| 4.969999999999916 | 2.985 |
| 4.974999999999916 | 2.985 |
| 4.979999999999916 | 2.985 |
| 4.984999999999916 | 2.985 |
| 4.989999999999916 | 2.985 |
| 4.994999999999916 | 2.985 |
| 4.999999999999916 | 2.985 |